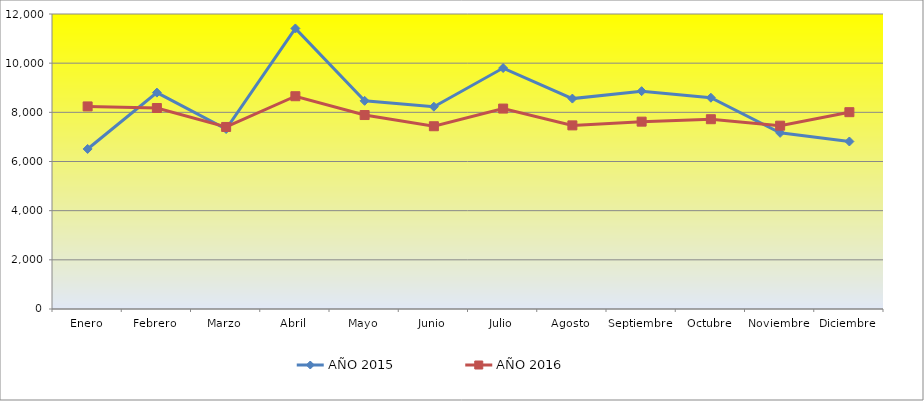
| Category | AÑO 2015 | AÑO 2016 |
|---|---|---|
| Enero | 6510 | 8240 |
| Febrero | 8802 | 8176 |
| Marzo | 7320 | 7405 |
| Abril | 11412 | 8655 |
| Mayo | 8468 | 7890 |
| Junio | 8229 | 7434 |
| Julio | 9801 | 8153 |
| Agosto | 8559 | 7469 |
| Septiembre | 8861 | 7621 |
| Octubre | 8594 | 7720 |
| Noviembre | 7165 | 7457 |
| Diciembre | 6814 | 8006 |